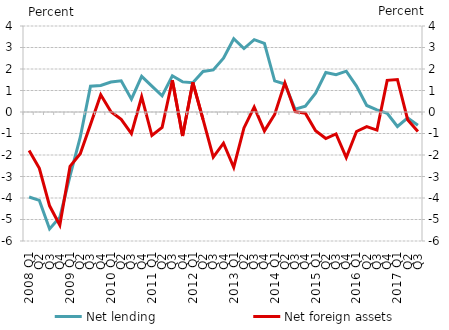
| Category | Net lending |
|---|---|
| 2008 Q1 | -3.953 |
| Q2 | -4.111 |
| Q3 | -5.439 |
| Q4 | -4.897 |
| 2009 Q1 | -2.976 |
| Q2 | -1.172 |
| Q3 | 1.202 |
| Q4 | 1.236 |
| 2010 Q1 | 1.395 |
| Q2 | 1.45 |
| Q3 | 0.599 |
| Q4 | 1.66 |
| 2011 Q1 | 1.204 |
| Q2 | 0.75 |
| Q3 | 1.683 |
| Q4 | 1.401 |
| 2012 Q1 | 1.365 |
| Q2 | 1.886 |
| Q3 | 1.959 |
| Q4 | 2.504 |
| 2013 Q1 | 3.407 |
| Q2 | 2.95 |
| Q3 | 3.365 |
| Q4 | 3.188 |
| 2014 Q1 | 1.447 |
| Q2 | 1.304 |
| Q3 | 0.127 |
| Q4 | 0.272 |
| 2015 Q1 | 0.874 |
| Q2 | 1.835 |
| Q3 | 1.736 |
| Q4 | 1.898 |
| 2016 Q1 | 1.205 |
| Q2 | 0.304 |
| Q3 | 0.099 |
| Q4 | -0.056 |
| 2017 Q1 | -0.673 |
| Q2 | -0.271 |
| Q3 | -0.615 |